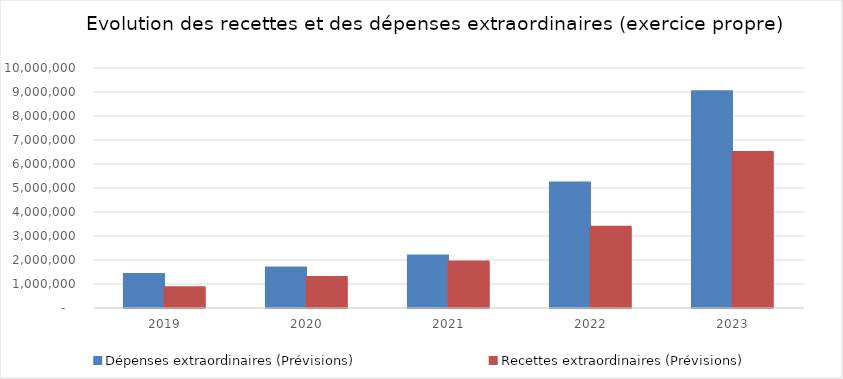
| Category | Dépenses extraordinaires (Prévisions) | Recettes extraordinaires (Prévisions) |
|---|---|---|
| 2019.0 | 1397141.74 | 842210.88 |
| 2020.0 | 1670197.5 | 1273397.6 |
| 2021.0 | 2164547.35 | 1918528.67 |
| 2022.0 | 5210331.95 | 3360086.63 |
| 2023.0 | 9005892.8 | 6475130.33 |